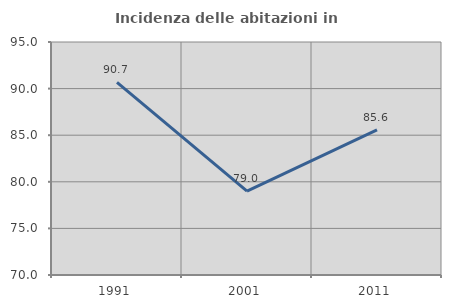
| Category | Incidenza delle abitazioni in proprietà  |
|---|---|
| 1991.0 | 90.678 |
| 2001.0 | 78.992 |
| 2011.0 | 85.577 |